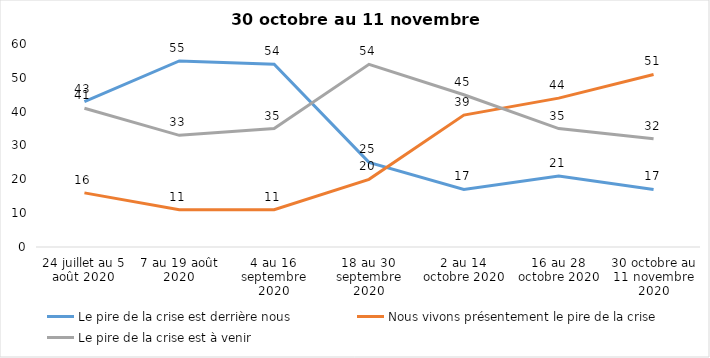
| Category | Le pire de la crise est derrière nous | Nous vivons présentement le pire de la crise | Le pire de la crise est à venir |
|---|---|---|---|
| 24 juillet au 5 août 2020 | 43 | 16 | 41 |
| 7 au 19 août 2020 | 55 | 11 | 33 |
| 4 au 16 septembre 2020 | 54 | 11 | 35 |
| 18 au 30 septembre 2020 | 25 | 20 | 54 |
| 2 au 14 octobre 2020 | 17 | 39 | 45 |
| 16 au 28 octobre 2020 | 21 | 44 | 35 |
| 30 octobre au 11 novembre 2020 | 17 | 51 | 32 |